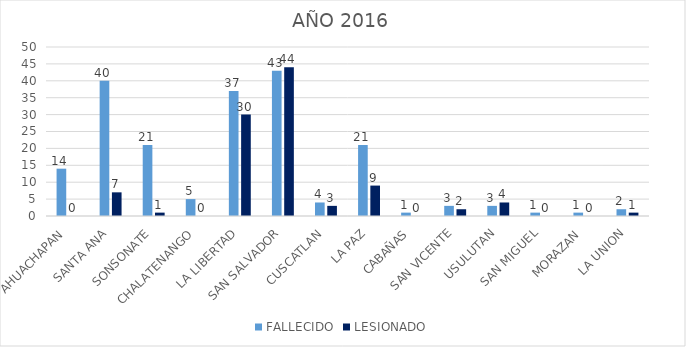
| Category | FALLECIDO | LESIONADO |
|---|---|---|
| AHUACHAPAN | 14 | 0 |
| SANTA ANA | 40 | 7 |
| SONSONATE | 21 | 1 |
| CHALATENANGO | 5 | 0 |
| LA LIBERTAD | 37 | 30 |
| SAN SALVADOR | 43 | 44 |
| CUSCATLAN | 4 | 3 |
| LA PAZ | 21 | 9 |
| CABAÑAS | 1 | 0 |
| SAN VICENTE | 3 | 2 |
| USULUTAN | 3 | 4 |
| SAN MIGUEL | 1 | 0 |
| MORAZAN | 1 | 0 |
| LA UNION | 2 | 1 |